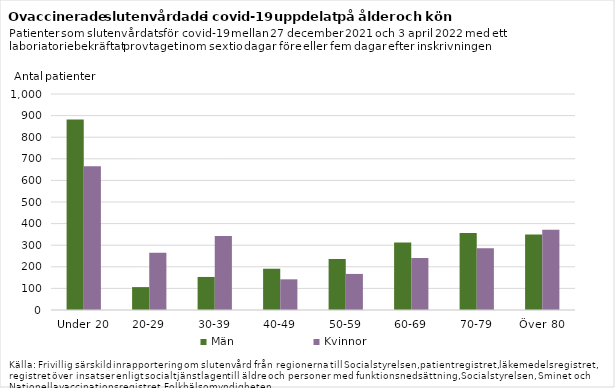
| Category | Män | Kvinnor |
|---|---|---|
| Under 20 | 882 | 665 |
| 20-29 | 106 | 265 |
| 30-39 | 153 | 343 |
| 40-49 | 191 | 142 |
| 50-59 | 236 | 167 |
| 60-69 | 313 | 241 |
| 70-79 | 356 | 286 |
| Över 80 | 349 | 372 |